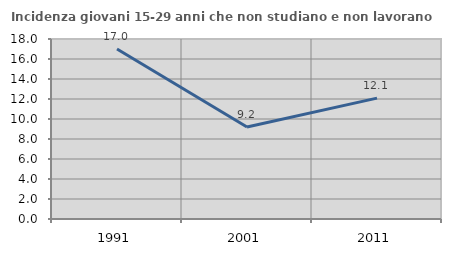
| Category | Incidenza giovani 15-29 anni che non studiano e non lavorano  |
|---|---|
| 1991.0 | 17.002 |
| 2001.0 | 9.208 |
| 2011.0 | 12.087 |